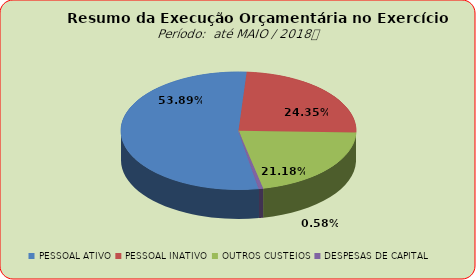
| Category | Series 0 |
|---|---|
| PESSOAL ATIVO | 61656463.99 |
| PESSOAL INATIVO | 27858741.33 |
| OUTROS CUSTEIOS | 24238342.2 |
| DESPESAS DE CAPITAL | 662494.93 |